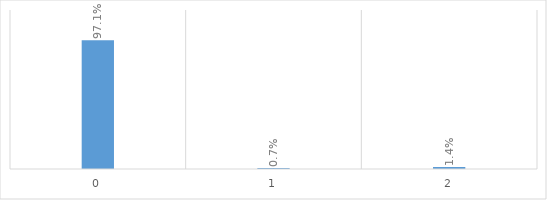
| Category | Series 0 |
|---|---|
| 0.0 | 0.971 |
| 1.0 | 0.007 |
| 2.0 | 0.014 |